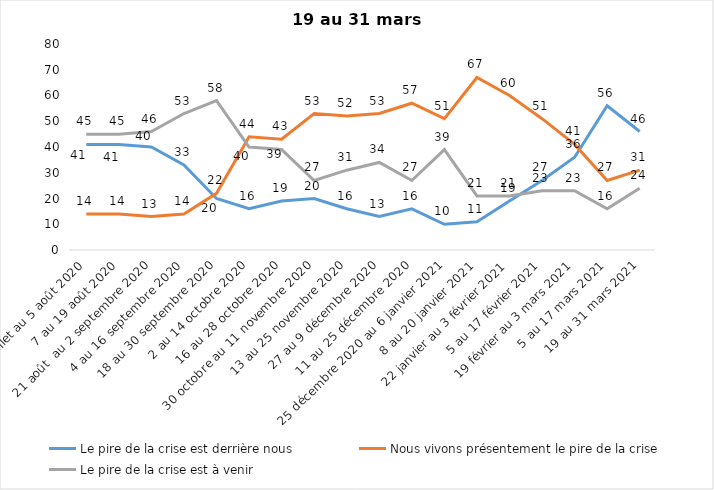
| Category | Le pire de la crise est derrière nous | Nous vivons présentement le pire de la crise | Le pire de la crise est à venir |
|---|---|---|---|
| 24 juillet au 5 août 2020 | 41 | 14 | 45 |
| 7 au 19 août 2020 | 41 | 14 | 45 |
| 21 août  au 2 septembre 2020 | 40 | 13 | 46 |
| 4 au 16 septembre 2020 | 33 | 14 | 53 |
| 18 au 30 septembre 2020 | 20 | 22 | 58 |
| 2 au 14 octobre 2020 | 16 | 44 | 40 |
| 16 au 28 octobre 2020 | 19 | 43 | 39 |
| 30 octobre au 11 novembre 2020 | 20 | 53 | 27 |
| 13 au 25 novembre 2020 | 16 | 52 | 31 |
| 27 au 9 décembre 2020 | 13 | 53 | 34 |
| 11 au 25 décembre 2020 | 16 | 57 | 27 |
| 25 décembre 2020 au 6 janvier 2021 | 10 | 51 | 39 |
| 8 au 20 janvier 2021 | 11 | 67 | 21 |
| 22 janvier au 3 février 2021 | 19 | 60 | 21 |
| 5 au 17 février 2021 | 27 | 51 | 23 |
| 19 février au 3 mars 2021 | 36 | 41 | 23 |
| 5 au 17 mars 2021 | 56 | 27 | 16 |
| 19 au 31 mars 2021 | 46 | 31 | 24 |